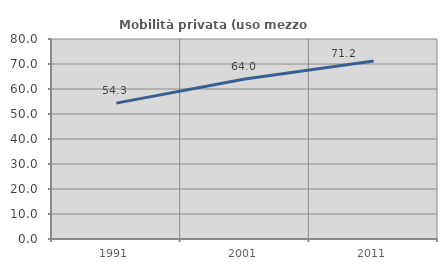
| Category | Mobilità privata (uso mezzo privato) |
|---|---|
| 1991.0 | 54.35 |
| 2001.0 | 63.976 |
| 2011.0 | 71.223 |